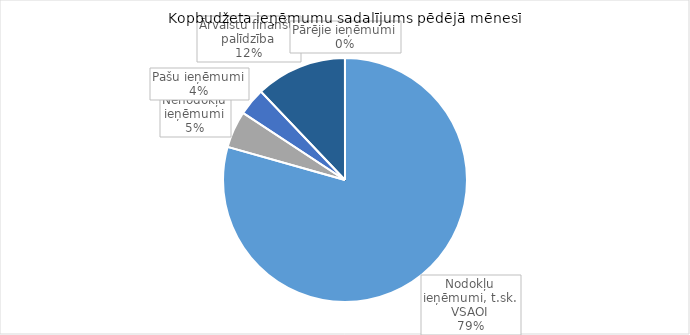
| Category | Series 0 |
|---|---|
| Nodokļu ieņēmumi, t.sk. VSAOI | 969994.081 |
| Nenodokļu ieņēmumi | 59638.622 |
| Pašu ieņēmumi | 44575.533 |
| Ārvalstu finanšu palīdzība | 147750.762 |
| Pārējie ieņēmumi | 71.586 |